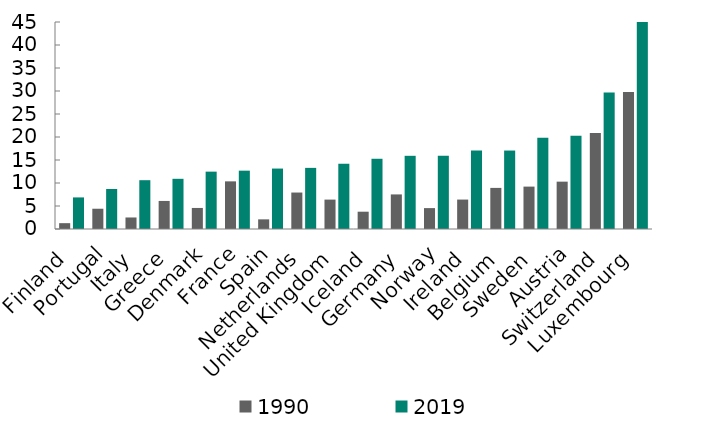
| Category | 1990 | 2019 |
|---|---|---|
| Finland | 1.268 | 6.866 |
| Portugal | 4.406 | 8.692 |
| Italy | 2.505 | 10.61 |
| Greece | 6.101 | 10.911 |
| Denmark | 4.575 | 12.47 |
| France | 10.356 | 12.682 |
| Spain | 2.096 | 13.139 |
| Netherlands | 7.927 | 13.287 |
| United Kingdom | 6.392 | 14.186 |
| Iceland | 3.761 | 15.268 |
| Germany | 7.518 | 15.91 |
| Norway | 4.542 | 15.923 |
| Ireland | 6.398 | 17.053 |
| Belgium | 8.935 | 17.056 |
| Sweden | 9.216 | 19.811 |
| Austria | 10.293 | 20.267 |
| Switzerland | 20.862 | 29.664 |
| Luxembourg | 29.806 | 48.303 |